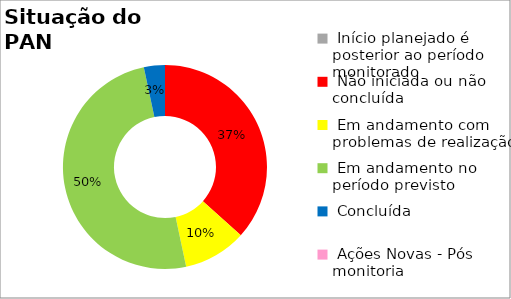
| Category | Series 0 |
|---|---|
|  Início planejado é posterior ao período monitorado | 0 |
|  Não iniciada ou não concluída | 0.367 |
|  Em andamento com problemas de realização | 0.1 |
|  Em andamento no período previsto  | 0.5 |
|  Concluída | 0.033 |
|  Ações Novas - Pós monitoria | 0 |